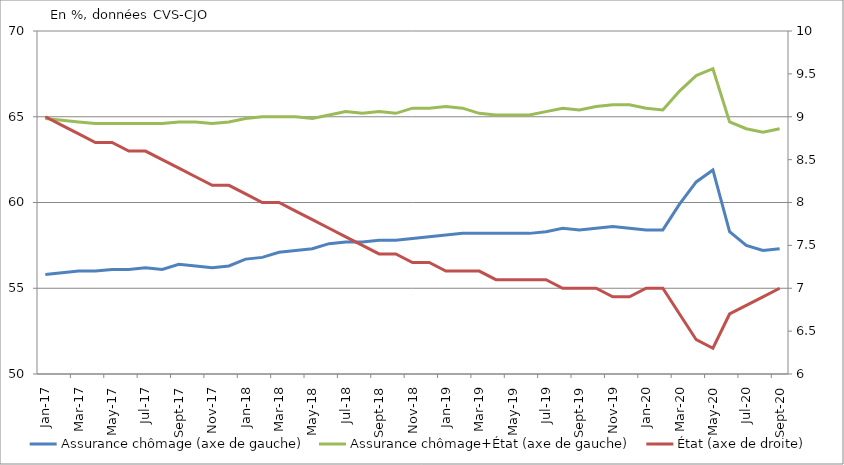
| Category | Assurance chômage (axe de gauche) | Assurance chômage+État (axe de gauche) |
|---|---|---|
| 2017-01-01 | 55.8 | 64.9 |
| 2017-02-01 | 55.9 | 64.8 |
| 2017-03-01 | 56 | 64.7 |
| 2017-04-01 | 56 | 64.6 |
| 2017-05-01 | 56.1 | 64.6 |
| 2017-06-01 | 56.1 | 64.6 |
| 2017-07-01 | 56.2 | 64.6 |
| 2017-08-01 | 56.1 | 64.6 |
| 2017-09-01 | 56.4 | 64.7 |
| 2017-10-01 | 56.3 | 64.7 |
| 2017-11-01 | 56.2 | 64.6 |
| 2017-12-01 | 56.3 | 64.7 |
| 2018-01-01 | 56.7 | 64.9 |
| 2018-02-01 | 56.8 | 65 |
| 2018-03-01 | 57.1 | 65 |
| 2018-04-01 | 57.2 | 65 |
| 2018-05-01 | 57.3 | 64.9 |
| 2018-06-01 | 57.6 | 65.1 |
| 2018-07-01 | 57.7 | 65.3 |
| 2018-08-01 | 57.7 | 65.2 |
| 2018-09-01 | 57.8 | 65.3 |
| 2018-10-01 | 57.8 | 65.2 |
| 2018-11-01 | 57.9 | 65.5 |
| 2018-12-01 | 58 | 65.5 |
| 2019-01-01 | 58.1 | 65.6 |
| 2019-02-01 | 58.2 | 65.5 |
| 2019-03-01 | 58.2 | 65.2 |
| 2019-04-01 | 58.2 | 65.1 |
| 2019-05-01 | 58.2 | 65.1 |
| 2019-06-01 | 58.2 | 65.1 |
| 2019-07-01 | 58.3 | 65.3 |
| 2019-08-01 | 58.5 | 65.5 |
| 2019-09-01 | 58.4 | 65.4 |
| 2019-10-01 | 58.5 | 65.6 |
| 2019-11-01 | 58.6 | 65.7 |
| 2019-12-01 | 58.5 | 65.7 |
| 2020-01-01 | 58.4 | 65.5 |
| 2020-02-01 | 58.4 | 65.4 |
| 2020-03-01 | 59.9 | 66.5 |
| 2020-04-01 | 61.2 | 67.4 |
| 2020-05-01 | 61.9 | 67.8 |
| 2020-06-01 | 58.3 | 64.7 |
| 2020-07-01 | 57.5 | 64.3 |
| 2020-08-01 | 57.2 | 64.1 |
| 2020-09-01 | 57.3 | 64.3 |